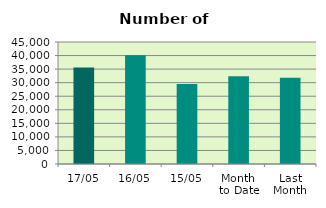
| Category | Series 0 |
|---|---|
| 17/05 | 35596 |
| 16/05 | 40108 |
| 15/05 | 29470 |
| Month 
to Date | 32328 |
| Last
Month | 31788.9 |